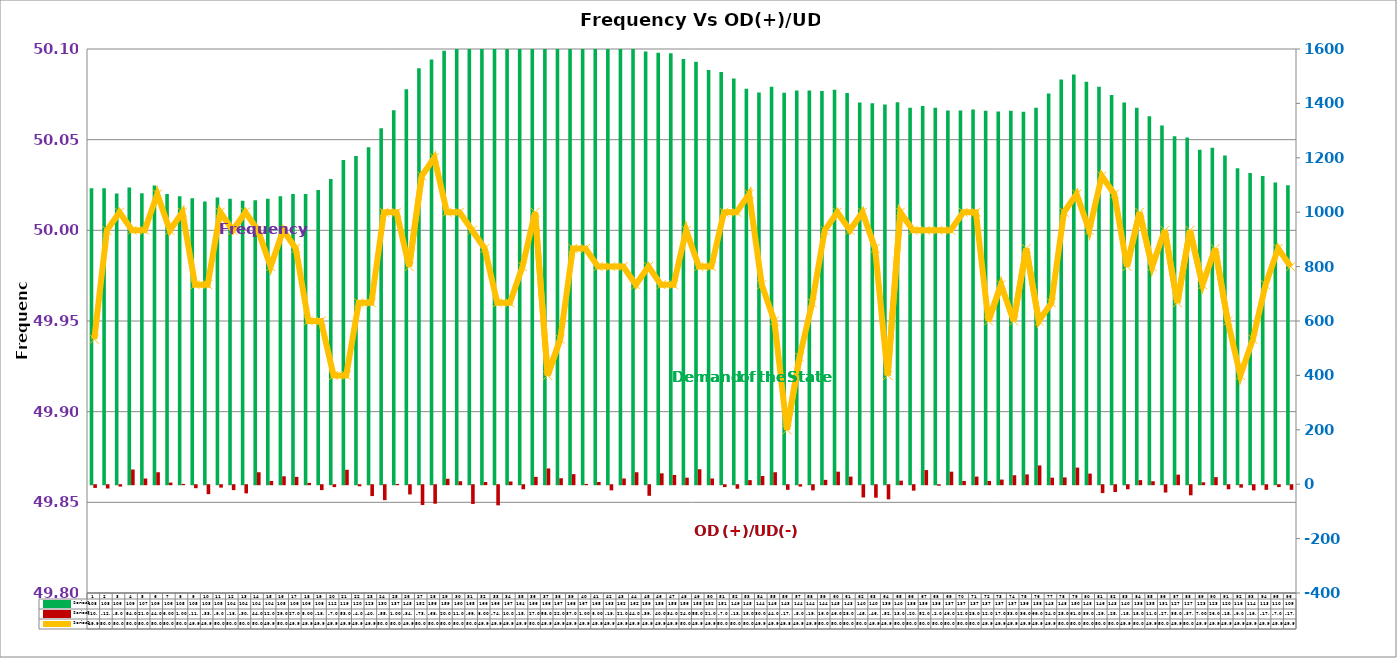
| Category | Series 2 | Series 4 |
|---|---|---|
| 0 | 1088 | -10 |
| 1 | 1088 | -12 |
| 2 | 1069 | -5 |
| 3 | 1091 | 54 |
| 4 | 1070 | 21 |
| 5 | 1098 | 44 |
| 6 | 1067 | 6 |
| 7 | 1059 | 1 |
| 8 | 1051 | -11 |
| 9 | 1039 | -33 |
| 10 | 1054 | -9 |
| 11 | 1049 | -18 |
| 12 | 1042 | -30 |
| 13 | 1044 | 44 |
| 14 | 1049 | 12 |
| 15 | 1059 | 29 |
| 16 | 1067 | 27 |
| 17 | 1067 | 5 |
| 18 | 1082 | -18 |
| 19 | 1122.333 | -7 |
| 20 | 1191.867 | 53 |
| 21 | 1207 | -4 |
| 22 | 1239 | -40 |
| 23 | 1309 | -55 |
| 24 | 1375 | 1 |
| 25 | 1452 | -34 |
| 26 | 1529 | -73 |
| 27 | 1561 | -68 |
| 28 | 1594 | 20 |
| 29 | 1607 | 11 |
| 30 | 1657 | -69 |
| 31 | 1664 | 8 |
| 32 | 1661 | -74 |
| 33 | 1674 | 10 |
| 34 | 1645 | -15 |
| 35 | 1666 | 27 |
| 36 | 1665 | 58 |
| 37 | 1671 | 22 |
| 38 | 1685 | 37 |
| 39 | 1672 | 1 |
| 40 | 1655 | 8 |
| 41 | 1635 | -19 |
| 42 | 1623 | 21 |
| 43 | 1623 | 44 |
| 44 | 1591 | -39 |
| 45 | 1586 | 40 |
| 46 | 1584 | 34 |
| 47 | 1563 | 24 |
| 48 | 1553 | 55 |
| 49 | 1523 | 21 |
| 50 | 1515 | -7 |
| 51 | 1492 | -13 |
| 52 | 1454 | 15 |
| 53 | 1440 | 30 |
| 54 | 1461 | 44 |
| 55 | 1439 | -17 |
| 56 | 1447 | -5 |
| 57 | 1447 | -19 |
| 58 | 1446 | 16 |
| 59 | 1450 | 46 |
| 60 | 1438 | 28 |
| 61 | 1403 | -45 |
| 62 | 1401 | -46 |
| 63 | 1396 | -52 |
| 64 | 1404 | 13 |
| 65 | 1384 | -20 |
| 66 | 1390 | 52 |
| 67 | 1384 | -2 |
| 68 | 1374 | 46 |
| 69 | 1374 | 12 |
| 70 | 1378 | 28 |
| 71 | 1373 | 12 |
| 72 | 1370 | 17 |
| 73 | 1373 | 33 |
| 74 | 1369 | 36 |
| 75 | 1384 | 69 |
| 76 | 1436 | 24 |
| 77 | 1488 | 25 |
| 78 | 1506 | 61 |
| 79 | 1480 | 39 |
| 80 | 1461 | -29 |
| 81 | 1431 | -25 |
| 82 | 1403 | -15 |
| 83 | 1384 | 15 |
| 84 | 1353 | 11 |
| 85 | 1319 | -27 |
| 86 | 1279 | 35 |
| 87 | 1275 | -37 |
| 88 | 1230 | 7 |
| 89 | 1237 | 26 |
| 90 | 1208 | -15 |
| 91 | 1162 | -9 |
| 92 | 1144 | -19 |
| 93 | 1133 | -17 |
| 94 | 1109 | -7 |
| 95 | 1099 | -17 |